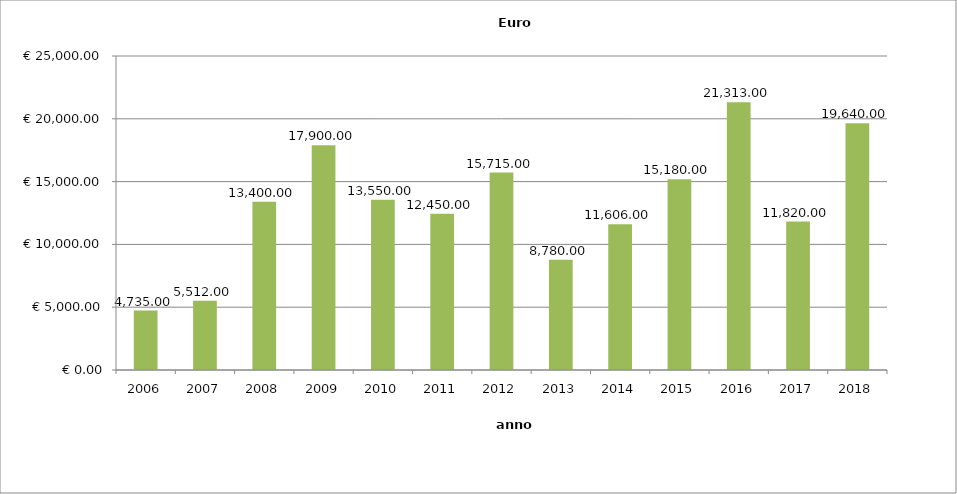
| Category | Euro |
|---|---|
| 2006.0 | 4735 |
| 2007.0 | 5512 |
| 2008.0 | 13400 |
| 2009.0 | 17900 |
| 2010.0 | 13550 |
| 2011.0 | 12450 |
| 2012.0 | 15715 |
| 2013.0 | 8780 |
| 2014.0 | 11606 |
| 2015.0 | 15180 |
| 2016.0 | 21313 |
| 2017.0 | 11820 |
| 2018.0 | 19640 |